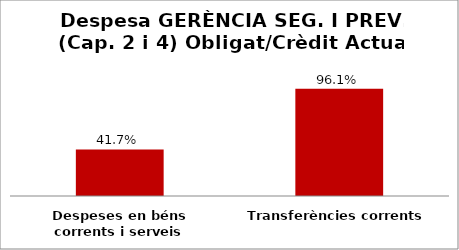
| Category | Series 0 |
|---|---|
| Despeses en béns corrents i serveis | 0.417 |
| Transferències corrents | 0.961 |